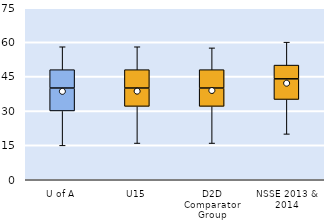
| Category | 25th | 50th | 75th |
|---|---|---|---|
| U of A | 30 | 10 | 8 |
| U15 | 32 | 8 | 8 |
| D2D Comparator Group | 32 | 8 | 8 |
| NSSE 2013 & 2014 | 35 | 9 | 6 |